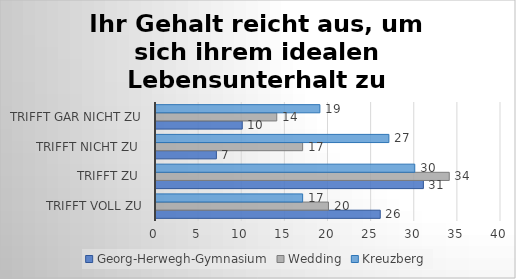
| Category | Georg-Herwegh-Gymnasium | Wedding | Kreuzberg |
|---|---|---|---|
| trifft voll zu | 26 | 20 | 17 |
| trifft zu  | 31 | 34 | 30 |
| trifft nicht zu  | 7 | 17 | 27 |
| trifft gar nicht zu | 10 | 14 | 19 |